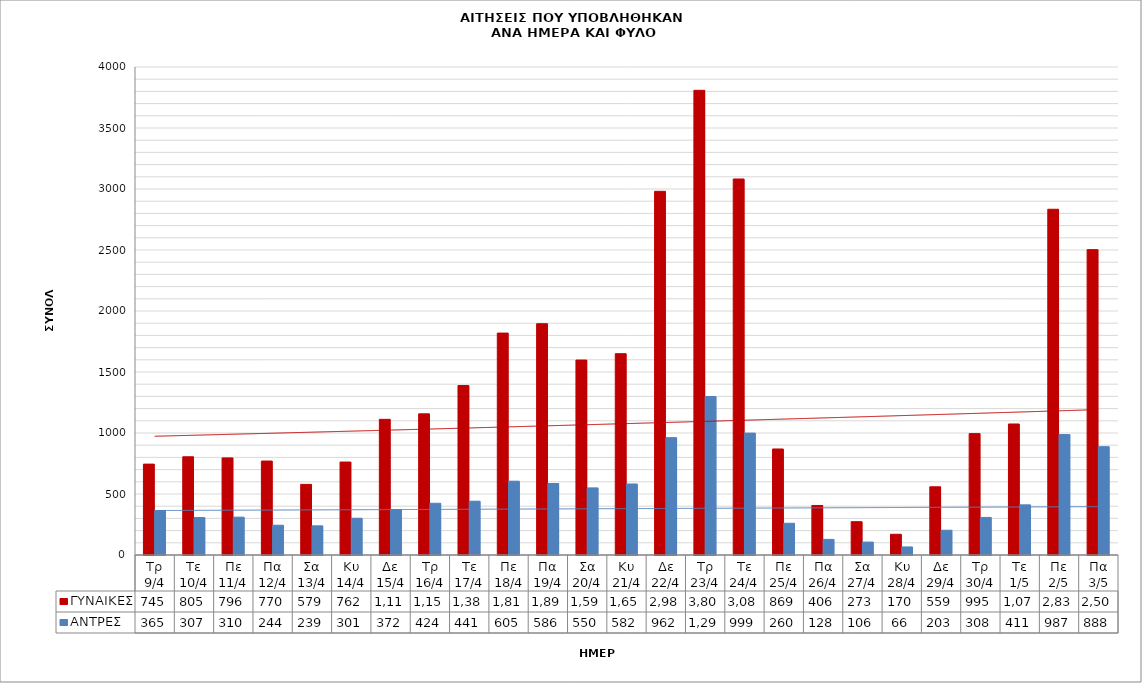
| Category | ΓΥΝΑΙΚΕΣ | ΑΝΤΡΕΣ |
|---|---|---|
| Τρ 9/4 | 745 | 365 |
| Τε 10/4 | 805 | 307 |
| Πε 11/4 | 796 | 310 |
| Πα 12/4 | 770 | 244 |
| Σα 13/4 | 579 | 239 |
| Κυ 14/4 | 762 | 301 |
| Δε 15/4 | 1112 | 372 |
| Τρ 16/4 | 1157 | 424 |
| Τε 17/4 | 1389 | 441 |
| Πε 18/4 | 1819 | 605 |
| Πα 19/4 | 1896 | 586 |
| Σα 20/4 | 1598 | 550 |
| Κυ 21/4 | 1650 | 582 |
| Δε 22/4 | 2981 | 962 |
| Τρ 23/4 | 3809 | 1299 |
| Τε 24/4 | 3082 | 999 |
| Πε 25/4 | 869 | 260 |
| Πα 26/4 | 406 | 128 |
| Σα 27/4 | 273 | 106 |
| Κυ 28/4 | 170 | 66 |
| Δε 29/4 | 559 | 203 |
| Τρ 30/4 | 995 | 308 |
| Τε 1/5 | 1074 | 411 |
| Πε 2/5 | 2834 | 987 |
| Πα 3/5 | 2503 | 888 |